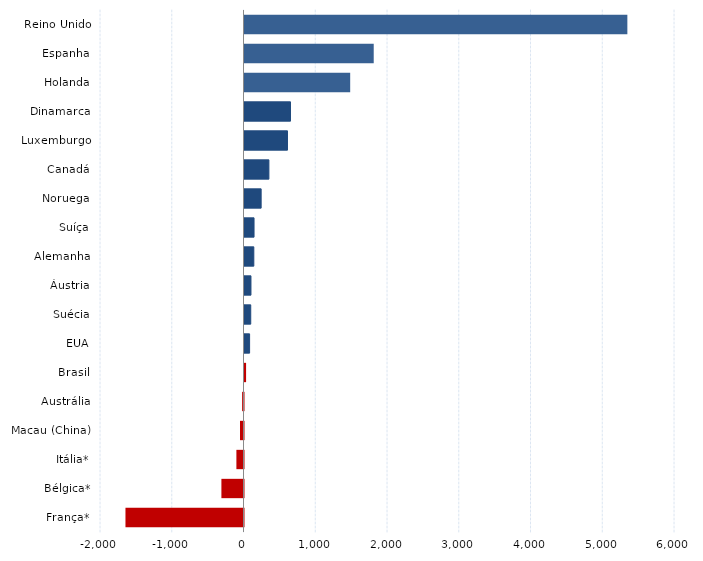
| Category | Series 0 |
|---|---|
| França* | -1645 |
| Bélgica* | -308 |
| Itália* | -99 |
| Macau (China) | -49 |
| Austrália | -19 |
| Brasil | 22 |
| EUA | 71 |
| Suécia | 87 |
| Áustria | 90 |
| Alemanha | 130 |
| Suíça | 133 |
| Noruega | 232 |
| Canadá | 340 |
| Luxemburgo | 599 |
| Dinamarca | 641 |
| Holanda | 1473 |
| Espanha | 1801 |
| Reino Unido | 5336 |